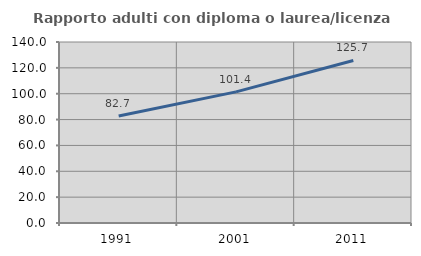
| Category | Rapporto adulti con diploma o laurea/licenza media  |
|---|---|
| 1991.0 | 82.715 |
| 2001.0 | 101.431 |
| 2011.0 | 125.713 |